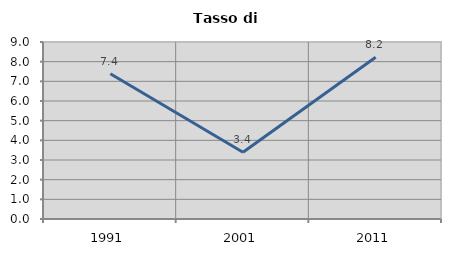
| Category | Tasso di disoccupazione   |
|---|---|
| 1991.0 | 7.383 |
| 2001.0 | 3.394 |
| 2011.0 | 8.224 |